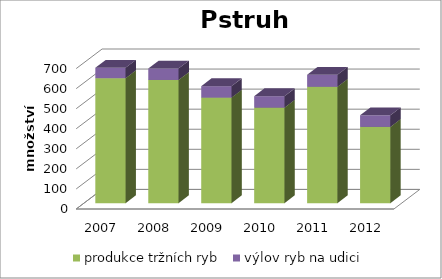
| Category | produkce tržních ryb | výlov ryb na udici |
|---|---|---|
| 2007.0 | 623 | 52 |
| 2008.0 | 614 | 57 |
| 2009.0 | 526 | 57 |
| 2010.0 | 476 | 57 |
| 2011.0 | 580 | 60 |
| 2012.0 | 380 | 58 |